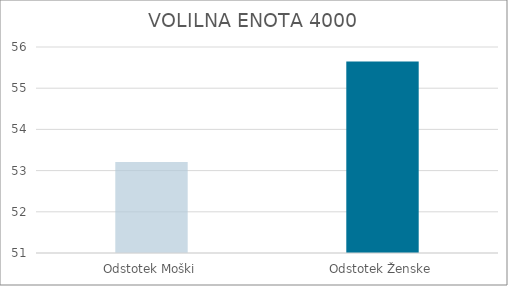
| Category | Series 0 |
|---|---|
| Odstotek Moški | 53.21 |
| Odstotek Ženske | 55.65 |